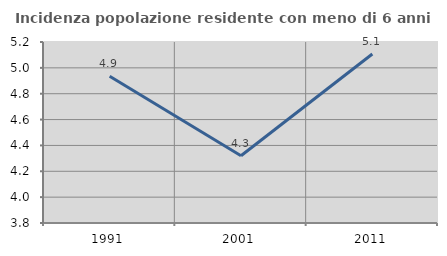
| Category | Incidenza popolazione residente con meno di 6 anni |
|---|---|
| 1991.0 | 4.935 |
| 2001.0 | 4.32 |
| 2011.0 | 5.108 |